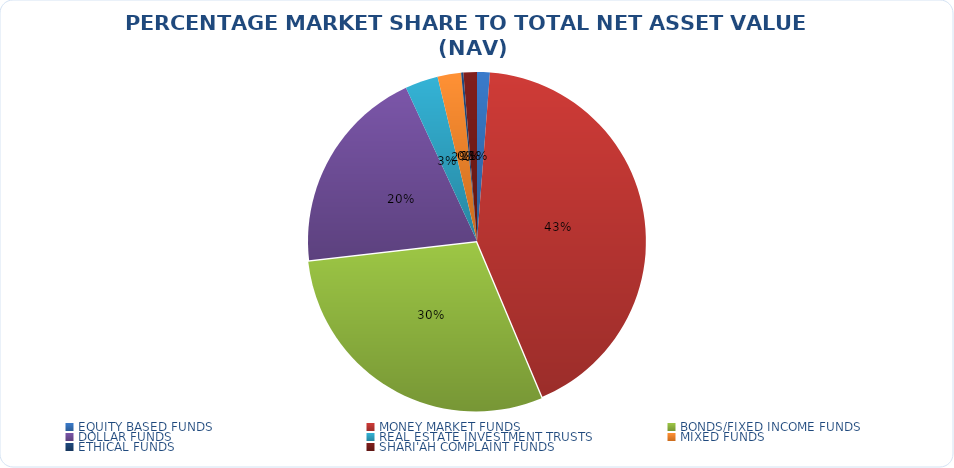
| Category | NET ASSET VALUE |
|---|---|
| EQUITY BASED FUNDS | 17573852370.656 |
| MONEY MARKET FUNDS | 609345211700.356 |
| BONDS/FIXED INCOME FUNDS | 423605832544.71 |
| DOLLAR FUNDS | 285856181895.646 |
| REAL ESTATE INVESTMENT TRUSTS | 45272071796.08 |
| MIXED FUNDS | 32284134552.049 |
| ETHICAL FUNDS | 3078030222.09 |
| SHARI'AH COMPLAINT FUNDS | 18480263659.26 |